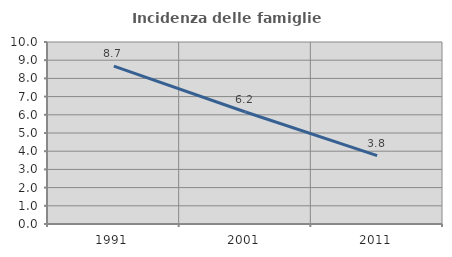
| Category | Incidenza delle famiglie numerose |
|---|---|
| 1991.0 | 8.671 |
| 2001.0 | 6.154 |
| 2011.0 | 3.754 |